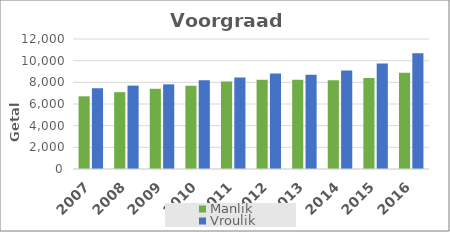
| Category | Manlik | Vroulik |
|---|---|---|
| 2007 | 6708 | 7465 |
| 2008 | 7093 | 7696 |
| 2009 | 7404 | 7815 |
| 2010 | 7682 | 8187 |
| 2011 | 8069 | 8455 |
| 2012 | 8233 | 8818 |
| 2013 | 8236 | 8696 |
| 2014 | 8201 | 9092 |
| 2015 | 8409 | 9729 |
| 2016 | 8891 | 10691 |